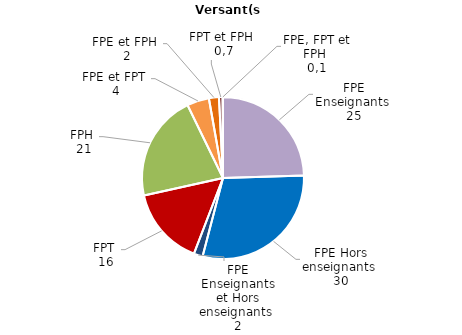
| Category | Series 0 |
|---|---|
| FPE Enseignants | 24.504 |
| FPE Hors enseignants | 29.552 |
| FPE Enseignants et Hors enseignants | 1.78 |
| FPT | 15.692 |
| FPH | 21.258 |
| FPE et FPT | 4.416 |
| FPE et FPH | 2.005 |
| FPT et FPH | 0.715 |
| FPE, FPT et FPH | 0.078 |